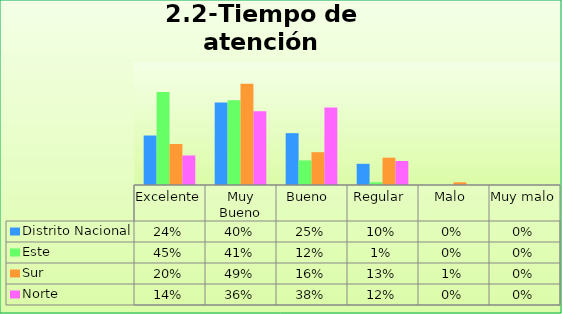
| Category | Distrito Nacional | Este | Sur  | Norte |
|---|---|---|---|---|
| Excelente | 0.241 | 0.453 | 0.2 | 0.144 |
| Muy Bueno | 0.402 | 0.413 | 0.493 | 0.36 |
| Bueno  | 0.253 | 0.12 | 0.16 | 0.378 |
| Regular  | 0.103 | 0.013 | 0.133 | 0.117 |
| Malo  | 0 | 0 | 0.013 | 0 |
| Muy malo  | 0 | 0 | 0 | 0 |